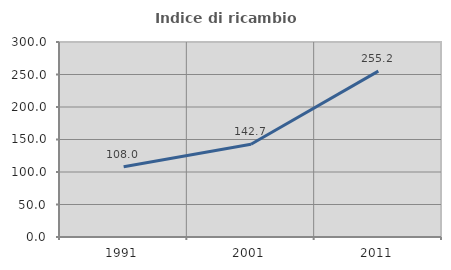
| Category | Indice di ricambio occupazionale  |
|---|---|
| 1991.0 | 108 |
| 2001.0 | 142.683 |
| 2011.0 | 255.224 |